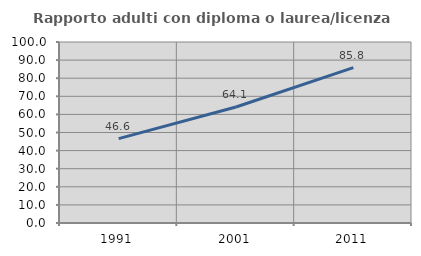
| Category | Rapporto adulti con diploma o laurea/licenza media  |
|---|---|
| 1991.0 | 46.629 |
| 2001.0 | 64.085 |
| 2011.0 | 85.842 |